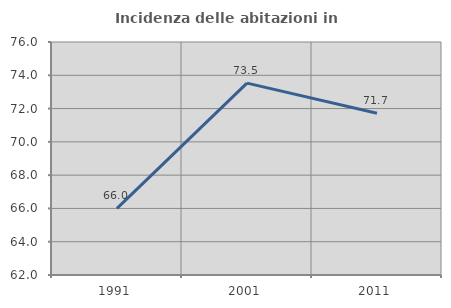
| Category | Incidenza delle abitazioni in proprietà  |
|---|---|
| 1991.0 | 66 |
| 2001.0 | 73.529 |
| 2011.0 | 71.721 |